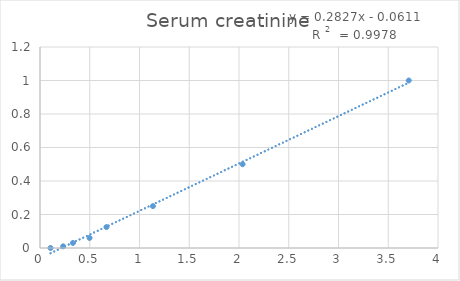
| Category | Serum creatinine |
|---|---|
| 0.106 | 0 |
| 0.233 | 0.01 |
| 0.331 | 0.03 |
| 0.498 | 0.06 |
| 0.668 | 0.125 |
| 1.135 | 0.25 |
| 2.036 | 0.5 |
| 3.706 | 1 |